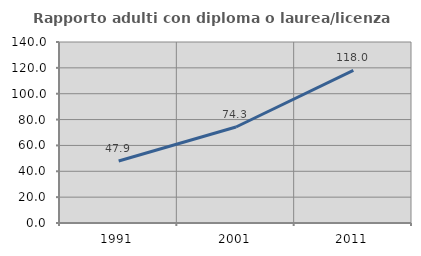
| Category | Rapporto adulti con diploma o laurea/licenza media  |
|---|---|
| 1991.0 | 47.945 |
| 2001.0 | 74.271 |
| 2011.0 | 117.985 |